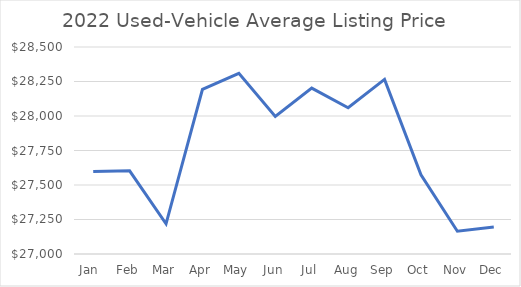
| Category | Series 0 |
|---|---|
| Jan  | 27597 |
| Feb | 27603 |
| Mar | 27219 |
| Apr | 28193 |
| May | 28309 |
| Jun | 27997 |
| Jul | 28202 |
| Aug | 28060 |
| Sep | 28265 |
| Oct | 27574 |
| Nov | 27165 |
| Dec | 27195 |